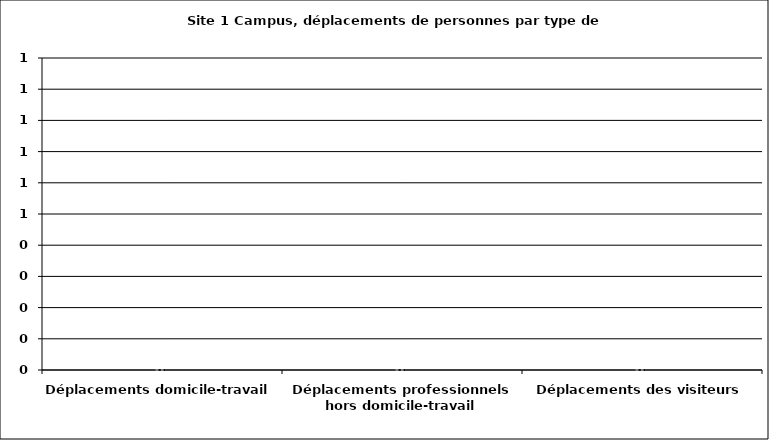
| Category | Type de parcours |
|---|---|
| Déplacements domicile-travail | 0 |
| Déplacements professionnels hors domicile-travail | 0 |
| Déplacements des visiteurs | 0 |